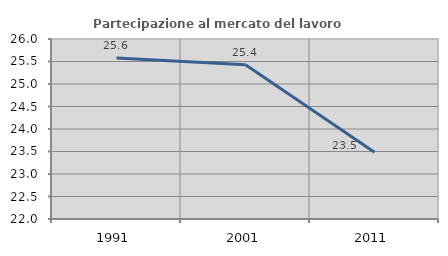
| Category | Partecipazione al mercato del lavoro  femminile |
|---|---|
| 1991.0 | 25.577 |
| 2001.0 | 25.428 |
| 2011.0 | 23.483 |